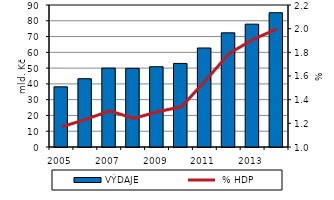
| Category | VÝDAJE |
|---|---|
| 2005.0 | 38.146 |
| 2006.0 | 43.268 |
| 2007.0 | 50.009 |
| 2008.0 | 49.872 |
| 2009.0 | 50.875 |
| 2010.0 | 52.974 |
| 2011.0 | 62.753 |
| 2012.0 | 72.36 |
| 2013.0 | 77.853 |
| 2014.0 | 85.104 |